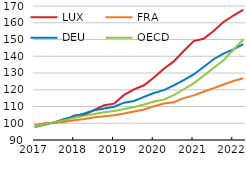
| Category | LUX | FRA | DEU | OECD |
|---|---|---|---|---|
| 2017-01-01 | 98.497 | 98.966 | 97.681 | 98.024 |
| 2017-04-01 | 99.794 | 99.639 | 99.07 | 99.431 |
| 2017-07-01 | 100.259 | 100.505 | 100.676 | 100.673 |
| 2017-10-01 | 101.45 | 100.89 | 102.573 | 101.872 |
| 2018-01-01 | 104.613 | 101.851 | 104.264 | 103.234 |
| 2018-04-01 | 104.869 | 102.525 | 105.814 | 104.408 |
| 2018-07-01 | 107.942 | 103.583 | 107.705 | 105.527 |
| 2018-10-01 | 110.808 | 104.16 | 108.779 | 106.501 |
| 2019-01-01 | 111.723 | 104.833 | 109.88 | 107.347 |
| 2019-04-01 | 116.928 | 105.795 | 112.301 | 108.466 |
| 2019-07-01 | 120.243 | 107.045 | 113.307 | 109.715 |
| 2019-10-01 | 122.656 | 108.199 | 115.707 | 111.209 |
| 2020-01-01 | 127.344 | 110.123 | 118.067 | 112.974 |
| 2020-04-01 | 132.516 | 111.758 | 119.778 | 114.113 |
| 2020-07-01 | 136.921 | 112.527 | 122.599 | 116.733 |
| 2020-10-01 | 143.108 | 115.028 | 125.726 | 120.294 |
| 2021-01-01 | 149.072 | 116.663 | 129.142 | 123.803 |
| 2021-04-01 | 150.428 | 118.779 | 133.566 | 128.357 |
| 2021-07-01 | 155.097 | 120.991 | 138.208 | 132.995 |
| 2021-10-01 | 160.45 | 123.107 | 141.535 | 137.553 |
| 2022-01-01 | 164.313 | 125.222 | 144.084 | 143.907 |
| 2022-04-01 | 167.804 | 126.857 | 147.236 | 149.958 |